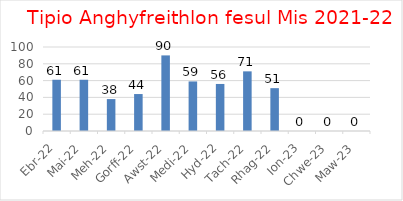
| Category | Series 0 |
|---|---|
| Ebr-22 | 61 |
| Mai-22 | 61 |
| Meh-22 | 38 |
| Gorff-22 | 44 |
| Awst-22 | 90 |
| Medi-22 | 59 |
| Hyd-22 | 56 |
| Tach-22 | 71 |
| Rhag-22 | 51 |
| Ion-23 | 0 |
| Chwe-23 | 0 |
| Maw-23 | 0 |